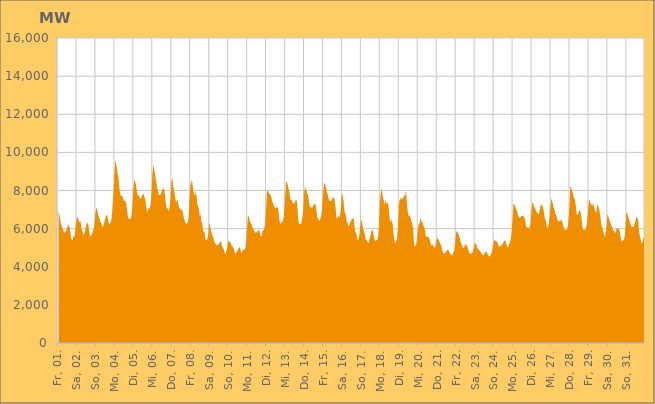
| Category | Series 0 |
|---|---|
|  Fr, 01.  | 6940.941 |
|  Fr, 01.  | 6739.258 |
|  Fr, 01.  | 6566.513 |
|  Fr, 01.  | 6304.722 |
|  Fr, 01.  | 6176.617 |
|  Fr, 01.  | 6011.631 |
|  Fr, 01.  | 5960.128 |
|  Fr, 01.  | 5780.79 |
|  Fr, 01.  | 5776.637 |
|  Fr, 01.  | 5831.027 |
|  Fr, 01.  | 5911.63 |
|  Fr, 01.  | 6049.373 |
|  Fr, 01.  | 6147.04 |
|  Fr, 01.  | 6184.899 |
|  Fr, 01.  | 6103.249 |
|  Fr, 01.  | 5828.684 |
|  Fr, 01.  | 5522.521 |
|  Sa, 02.  | 5409.463 |
|  Sa, 02.  | 5405.658 |
|  Sa, 02.  | 5591.512 |
|  Sa, 02.  | 5576.093 |
|  Sa, 02.  | 5728.649 |
|  Sa, 02.  | 6149.572 |
|  Sa, 02.  | 6496.762 |
|  Sa, 02.  | 6644.999 |
|  Sa, 02.  | 6506.655 |
|  Sa, 02.  | 6364.943 |
|  Sa, 02.  | 6335.772 |
|  Sa, 02.  | 6411.474 |
|  Sa, 02.  | 6051.06 |
|  Sa, 02.  | 5907.813 |
|  Sa, 02.  | 5770.088 |
|  Sa, 02.  | 5649.798 |
|  Sa, 02.  | 5758.059 |
|  Sa, 02.  | 5928.191 |
|  Sa, 02.  | 6102.328 |
|  Sa, 02.  | 6326.658 |
|  Sa, 02.  | 6273.171 |
|  Sa, 02.  | 6219.023 |
|  Sa, 02.  | 5820.166 |
|  Sa, 02.  | 5621.213 |
|  So, 03.  | 5581.824 |
|  So, 03.  | 5698.178 |
|  So, 03.  | 5755.172 |
|  So, 03.  | 5892.121 |
|  So, 03.  | 6033.169 |
|  So, 03.  | 6398.499 |
|  So, 03.  | 6897.129 |
|  So, 03.  | 7100.668 |
|  So, 03.  | 6984.817 |
|  So, 03.  | 6787.739 |
|  So, 03.  | 6628.526 |
|  So, 03.  | 6524.965 |
|  So, 03.  | 6350.751 |
|  So, 03.  | 6311.71 |
|  So, 03.  | 6190.914 |
|  So, 03.  | 6095.488 |
|  So, 03.  | 6129.065 |
|  So, 03.  | 6320.316 |
|  So, 03.  | 6461.078 |
|  So, 03.  | 6648.03 |
|  So, 03.  | 6714.557 |
|  So, 03.  | 6678.762 |
|  So, 03.  | 6441.161 |
|  So, 03.  | 6230.416 |
|  Mo, 04.  | 6219.88 |
|  Mo, 04.  | 6301.203 |
|  Mo, 04.  | 6453.599 |
|  Mo, 04.  | 6841.81 |
|  Mo, 04.  | 7497.036 |
|  Mo, 04.  | 8145.848 |
|  Mo, 04.  | 9015.004 |
|  Mo, 04.  | 9596.306 |
|  Mo, 04.  | 9405.317 |
|  Mo, 04.  | 9173.858 |
|  Mo, 04.  | 8860.302 |
|  Mo, 04.  | 8664.048 |
|  Mo, 04.  | 8208.187 |
|  Mo, 04.  | 7875.951 |
|  Mo, 04.  | 7732.502 |
|  Mo, 04.  | 7705.777 |
|  Mo, 04.  | 7732.987 |
|  Mo, 04.  | 7557.301 |
|  Mo, 04.  | 7435.131 |
|  Mo, 04.  | 7488.971 |
|  Mo, 04.  | 7441.708 |
|  Mo, 04.  | 7243.512 |
|  Mo, 04.  | 6962.741 |
|  Mo, 04.  | 6588.049 |
|  Di, 05.  | 6516.35 |
|  Di, 05.  | 6500.748 |
|  Di, 05.  | 6518.257 |
|  Di, 05.  | 6580.313 |
|  Di, 05.  | 6842.617 |
|  Di, 05.  | 7400.402 |
|  Di, 05.  | 8178.42 |
|  Di, 05.  | 8584.927 |
|  Di, 05.  | 8478.571 |
|  Di, 05.  | 8344.882 |
|  Di, 05.  | 8059.395 |
|  Di, 05.  | 7802.997 |
|  Di, 05.  | 7687.231 |
|  Di, 05.  | 7793.313 |
|  Di, 05.  | 7573.076 |
|  Di, 05.  | 7581.47 |
|  Di, 05.  | 7620.603 |
|  Di, 05.  | 7731.48 |
|  Di, 05.  | 7819.04 |
|  Di, 05.  | 7792.946 |
|  Di, 05.  | 7644.386 |
|  Di, 05.  | 7524.985 |
|  Di, 05.  | 7194.424 |
|  Di, 05.  | 6937.691 |
|  Mi, 06.  | 6901.247 |
|  Mi, 06.  | 7054.522 |
|  Mi, 06.  | 7062.578 |
|  Mi, 06.  | 7142.579 |
|  Mi, 06.  | 7385.198 |
|  Mi, 06.  | 8009.252 |
|  Mi, 06.  | 8886.016 |
|  Mi, 06.  | 9361.659 |
|  Mi, 06.  | 9191.132 |
|  Mi, 06.  | 8954.559 |
|  Mi, 06.  | 8681.927 |
|  Mi, 06.  | 8429.152 |
|  Mi, 06.  | 8149.973 |
|  Mi, 06.  | 7943.551 |
|  Mi, 06.  | 7775.279 |
|  Mi, 06.  | 7766.127 |
|  Mi, 06.  | 7766.795 |
|  Mi, 06.  | 7847.61 |
|  Mi, 06.  | 7992.179 |
|  Mi, 06.  | 8078.613 |
|  Mi, 06.  | 8131.767 |
|  Mi, 06.  | 8058.626 |
|  Mi, 06.  | 7659.033 |
|  Mi, 06.  | 7307.349 |
|  Do, 07.  | 7118.383 |
|  Do, 07.  | 7062.172 |
|  Do, 07.  | 6982.827 |
|  Do, 07.  | 6934.237 |
|  Do, 07.  | 7135.811 |
|  Do, 07.  | 7627.733 |
|  Do, 07.  | 8408.204 |
|  Do, 07.  | 8706.665 |
|  Do, 07.  | 8384.46 |
|  Do, 07.  | 8043.776 |
|  Do, 07.  | 7889.435 |
|  Do, 07.  | 7565.477 |
|  Do, 07.  | 7361.658 |
|  Do, 07.  | 7485.652 |
|  Do, 07.  | 7512.454 |
|  Do, 07.  | 7219.673 |
|  Do, 07.  | 7034.614 |
|  Do, 07.  | 7091.704 |
|  Do, 07.  | 6969.811 |
|  Do, 07.  | 7008.317 |
|  Do, 07.  | 6934.862 |
|  Do, 07.  | 6729.743 |
|  Do, 07.  | 6515.774 |
|  Do, 07.  | 6386.887 |
|  Fr, 08.  | 6299.63 |
|  Fr, 08.  | 6245.341 |
|  Fr, 08.  | 6286.407 |
|  Fr, 08.  | 6355.04 |
|  Fr, 08.  | 6658.022 |
|  Fr, 08.  | 7528.907 |
|  Fr, 08.  | 8250.186 |
|  Fr, 08.  | 8366.781 |
|  Fr, 08.  | 8564.421 |
|  Fr, 08.  | 8268.524 |
|  Fr, 08.  | 7974.971 |
|  Fr, 08.  | 7771.758 |
|  Fr, 08.  | 7752.536 |
|  Fr, 08.  | 7986.519 |
|  Fr, 08.  | 7638.517 |
|  Fr, 08.  | 7242.194 |
|  Fr, 08.  | 7181.447 |
|  Fr, 08.  | 6936.455 |
|  Fr, 08.  | 6651.68 |
|  Fr, 08.  | 6752.367 |
|  Fr, 08.  | 6356.49 |
|  Fr, 08.  | 6293.274 |
|  Fr, 08.  | 5955.833 |
|  Fr, 08.  | 5835.241 |
|  Sa, 09.  | 5844.34 |
|  Sa, 09.  | 5431.488 |
|  Sa, 09.  | 5407.277 |
|  Sa, 09.  | 5414.671 |
|  Sa, 09.  | 5508.668 |
|  Sa, 09.  | 5841.217 |
|  Sa, 09.  | 6315.136 |
|  Sa, 09.  | 6139.232 |
|  Sa, 09.  | 5931.343 |
|  Sa, 09.  | 5770.202 |
|  Sa, 09.  | 5645.962 |
|  Sa, 09.  | 5521.496 |
|  Sa, 09.  | 5338.773 |
|  Sa, 09.  | 5282.91 |
|  Sa, 09.  | 5176.031 |
|  Sa, 09.  | 5116.956 |
|  Sa, 09.  | 5170.961 |
|  Sa, 09.  | 5144.261 |
|  Sa, 09.  | 5169.052 |
|  Sa, 09.  | 5285.176 |
|  Sa, 09.  | 5295.284 |
|  Sa, 09.  | 5318.763 |
|  Sa, 09.  | 5142.766 |
|  Sa, 09.  | 4984.332 |
|  So, 10.  | 4947.268 |
|  So, 10.  | 4809.949 |
|  So, 10.  | 4657.779 |
|  So, 10.  | 4750.905 |
|  So, 10.  | 4888.639 |
|  So, 10.  | 5074.729 |
|  So, 10.  | 5310.93 |
|  So, 10.  | 5350.461 |
|  So, 10.  | 5298.902 |
|  So, 10.  | 5227.756 |
|  So, 10.  | 5142.026 |
|  So, 10.  | 5091.097 |
|  So, 10.  | 5021.757 |
|  So, 10.  | 4949.633 |
|  So, 10.  | 4767.51 |
|  So, 10.  | 4671.282 |
|  So, 10.  | 4720.537 |
|  So, 10.  | 4798.763 |
|  So, 10.  | 4877.039 |
|  So, 10.  | 4981.945 |
|  So, 10.  | 5013.374 |
|  So, 10.  | 5018.523 |
|  So, 10.  | 4784.32 |
|  So, 10.  | 4698.295 |
|  Mo, 11.  | 4872.63 |
|  Mo, 11.  | 4913.115 |
|  Mo, 11.  | 4875.96 |
|  Mo, 11.  | 4907.183 |
|  Mo, 11.  | 5058.537 |
|  Mo, 11.  | 5512.991 |
|  Mo, 11.  | 6140.837 |
|  Mo, 11.  | 6720.662 |
|  Mo, 11.  | 6625.872 |
|  Mo, 11.  | 6438.764 |
|  Mo, 11.  | 6286.551 |
|  Mo, 11.  | 6304.206 |
|  Mo, 11.  | 6148.903 |
|  Mo, 11.  | 6035.615 |
|  Mo, 11.  | 5964.99 |
|  Mo, 11.  | 5870.878 |
|  Mo, 11.  | 5797.363 |
|  Mo, 11.  | 5789.082 |
|  Mo, 11.  | 5869.312 |
|  Mo, 11.  | 5756.9 |
|  Mo, 11.  | 5914.239 |
|  Mo, 11.  | 5979.977 |
|  Mo, 11.  | 5790.845 |
|  Mo, 11.  | 5613.295 |
|  Di, 12.  | 5590.568 |
|  Di, 12.  | 5793.735 |
|  Di, 12.  | 5962.776 |
|  Di, 12.  | 5882.813 |
|  Di, 12.  | 6107.506 |
|  Di, 12.  | 6428.469 |
|  Di, 12.  | 7082.548 |
|  Di, 12.  | 7955.311 |
|  Di, 12.  | 8036.85 |
|  Di, 12.  | 7901.588 |
|  Di, 12.  | 7828.11 |
|  Di, 12.  | 7787.923 |
|  Di, 12.  | 7715.321 |
|  Di, 12.  | 7564.619 |
|  Di, 12.  | 7367.352 |
|  Di, 12.  | 7293.897 |
|  Di, 12.  | 7201.136 |
|  Di, 12.  | 7074.018 |
|  Di, 12.  | 7083.794 |
|  Di, 12.  | 7124.641 |
|  Di, 12.  | 7117.595 |
|  Di, 12.  | 7074.525 |
|  Di, 12.  | 6725.93 |
|  Di, 12.  | 6367.575 |
|  Mi, 13.  | 6253.256 |
|  Mi, 13.  | 6313.547 |
|  Mi, 13.  | 6347.619 |
|  Mi, 13.  | 6385.207 |
|  Mi, 13.  | 6559.589 |
|  Mi, 13.  | 6955.706 |
|  Mi, 13.  | 7693.446 |
|  Mi, 13.  | 8375.839 |
|  Mi, 13.  | 8493.11 |
|  Mi, 13.  | 8347.929 |
|  Mi, 13.  | 8170.31 |
|  Mi, 13.  | 7957.844 |
|  Mi, 13.  | 7737.442 |
|  Mi, 13.  | 7482.862 |
|  Mi, 13.  | 7525.191 |
|  Mi, 13.  | 7428.151 |
|  Mi, 13.  | 7323.42 |
|  Mi, 13.  | 7315.59 |
|  Mi, 13.  | 7348.202 |
|  Mi, 13.  | 7483.458 |
|  Mi, 13.  | 7499.139 |
|  Mi, 13.  | 7428.787 |
|  Mi, 13.  | 6776.912 |
|  Mi, 13.  | 6355.77 |
|  Do, 14.  | 6241.039 |
|  Do, 14.  | 6232.647 |
|  Do, 14.  | 6229.824 |
|  Do, 14.  | 6382.673 |
|  Do, 14.  | 6598.99 |
|  Do, 14.  | 7048.792 |
|  Do, 14.  | 7803.635 |
|  Do, 14.  | 8238.75 |
|  Do, 14.  | 8054.808 |
|  Do, 14.  | 7997.929 |
|  Do, 14.  | 7862.467 |
|  Do, 14.  | 7721.193 |
|  Do, 14.  | 7500.142 |
|  Do, 14.  | 7191.403 |
|  Do, 14.  | 7120.131 |
|  Do, 14.  | 7143.967 |
|  Do, 14.  | 7023.727 |
|  Do, 14.  | 7168.092 |
|  Do, 14.  | 7224.247 |
|  Do, 14.  | 7289.154 |
|  Do, 14.  | 7308.468 |
|  Do, 14.  | 7157.33 |
|  Do, 14.  | 6801.337 |
|  Do, 14.  | 6549.014 |
|  Fr, 15.  | 6467.612 |
|  Fr, 15.  | 6450.168 |
|  Fr, 15.  | 6429.603 |
|  Fr, 15.  | 6590.064 |
|  Fr, 15.  | 6737.266 |
|  Fr, 15.  | 7164.789 |
|  Fr, 15.  | 7774.759 |
|  Fr, 15.  | 8313.161 |
|  Fr, 15.  | 8404.439 |
|  Fr, 15.  | 8277.145 |
|  Fr, 15.  | 8123.878 |
|  Fr, 15.  | 7892.338 |
|  Fr, 15.  | 7766.099 |
|  Fr, 15.  | 7570.181 |
|  Fr, 15.  | 7463.245 |
|  Fr, 15.  | 7432.112 |
|  Fr, 15.  | 7460.054 |
|  Fr, 15.  | 7480.432 |
|  Fr, 15.  | 7651.747 |
|  Fr, 15.  | 7620.449 |
|  Fr, 15.  | 7615.155 |
|  Fr, 15.  | 7452.642 |
|  Fr, 15.  | 7000.116 |
|  Fr, 15.  | 6587.854 |
|  Sa, 16.  | 6518.375 |
|  Sa, 16.  | 6617.061 |
|  Sa, 16.  | 6673.63 |
|  Sa, 16.  | 6564.798 |
|  Sa, 16.  | 6813.724 |
|  Sa, 16.  | 7311.014 |
|  Sa, 16.  | 7855.725 |
|  Sa, 16.  | 7711.247 |
|  Sa, 16.  | 7421.939 |
|  Sa, 16.  | 6960.778 |
|  Sa, 16.  | 6783.763 |
|  Sa, 16.  | 6673.933 |
|  Sa, 16.  | 6375.329 |
|  Sa, 16.  | 6283.528 |
|  Sa, 16.  | 6132.714 |
|  Sa, 16.  | 6140.849 |
|  Sa, 16.  | 6302.634 |
|  Sa, 16.  | 6369.684 |
|  Sa, 16.  | 6482.692 |
|  Sa, 16.  | 6542.46 |
|  Sa, 16.  | 6524.826 |
|  Sa, 16.  | 6454.729 |
|  Sa, 16.  | 6056.191 |
|  Sa, 16.  | 5829.791 |
|  So, 17.  | 5765.609 |
|  So, 17.  | 5523.428 |
|  So, 17.  | 5401.811 |
|  So, 17.  | 5448.04 |
|  So, 17.  | 5687.386 |
|  So, 17.  | 6085.963 |
|  So, 17.  | 6516.833 |
|  So, 17.  | 6333.672 |
|  So, 17.  | 6171.106 |
|  So, 17.  | 5942.322 |
|  So, 17.  | 5826.132 |
|  So, 17.  | 5672.835 |
|  So, 17.  | 5434.964 |
|  So, 17.  | 5402.992 |
|  So, 17.  | 5326.135 |
|  So, 17.  | 5225.341 |
|  So, 17.  | 5276.278 |
|  So, 17.  | 5482.074 |
|  So, 17.  | 5634.32 |
|  So, 17.  | 5845.64 |
|  So, 17.  | 5915.769 |
|  So, 17.  | 5928.856 |
|  So, 17.  | 5645.638 |
|  So, 17.  | 5471.489 |
|  Mo, 18.  | 5388.233 |
|  Mo, 18.  | 5349.83 |
|  Mo, 18.  | 5417.257 |
|  Mo, 18.  | 5432.458 |
|  Mo, 18.  | 5614.432 |
|  Mo, 18.  | 6370.615 |
|  Mo, 18.  | 7383.598 |
|  Mo, 18.  | 7873.872 |
|  Mo, 18.  | 8101.908 |
|  Mo, 18.  | 7847.805 |
|  Mo, 18.  | 7591.516 |
|  Mo, 18.  | 7449.332 |
|  Mo, 18.  | 7226.747 |
|  Mo, 18.  | 7493.631 |
|  Mo, 18.  | 7352.321 |
|  Mo, 18.  | 7275.685 |
|  Mo, 18.  | 7408.105 |
|  Mo, 18.  | 7095.693 |
|  Mo, 18.  | 6580.459 |
|  Mo, 18.  | 6362.076 |
|  Mo, 18.  | 6364.488 |
|  Mo, 18.  | 6490.26 |
|  Mo, 18.  | 6253.468 |
|  Mo, 18.  | 5801.814 |
|  Di, 19.  | 5500.135 |
|  Di, 19.  | 5210.391 |
|  Di, 19.  | 5291.055 |
|  Di, 19.  | 5369.21 |
|  Di, 19.  | 5579.766 |
|  Di, 19.  | 6232.171 |
|  Di, 19.  | 7218.992 |
|  Di, 19.  | 7522.47 |
|  Di, 19.  | 7561.012 |
|  Di, 19.  | 7644.927 |
|  Di, 19.  | 7470.838 |
|  Di, 19.  | 7689.736 |
|  Di, 19.  | 7610.502 |
|  Di, 19.  | 7783.359 |
|  Di, 19.  | 7708.839 |
|  Di, 19.  | 8042.584 |
|  Di, 19.  | 7371.188 |
|  Di, 19.  | 6965.758 |
|  Di, 19.  | 6644.872 |
|  Di, 19.  | 6725.097 |
|  Di, 19.  | 6648.919 |
|  Di, 19.  | 6525.687 |
|  Di, 19.  | 6359.439 |
|  Di, 19.  | 6217.795 |
|  Mi, 20.  | 5992.014 |
|  Mi, 20.  | 5344.977 |
|  Mi, 20.  | 5044.105 |
|  Mi, 20.  | 5098.006 |
|  Mi, 20.  | 5184.452 |
|  Mi, 20.  | 5459.634 |
|  Mi, 20.  | 5913.645 |
|  Mi, 20.  | 6262.357 |
|  Mi, 20.  | 6214.271 |
|  Mi, 20.  | 6557.803 |
|  Mi, 20.  | 6482.433 |
|  Mi, 20.  | 6327.669 |
|  Mi, 20.  | 6329.755 |
|  Mi, 20.  | 6178.632 |
|  Mi, 20.  | 6031.205 |
|  Mi, 20.  | 5940.093 |
|  Mi, 20.  | 5620.781 |
|  Mi, 20.  | 5554.018 |
|  Mi, 20.  | 5582.766 |
|  Mi, 20.  | 5546.22 |
|  Mi, 20.  | 5532.386 |
|  Mi, 20.  | 5434.841 |
|  Mi, 20.  | 5251.835 |
|  Mi, 20.  | 5093.857 |
|  Do, 21.  | 5167.147 |
|  Do, 21.  | 5145.073 |
|  Do, 21.  | 5049.425 |
|  Do, 21.  | 4997.143 |
|  Do, 21.  | 5031.824 |
|  Do, 21.  | 5207.492 |
|  Do, 21.  | 5488.804 |
|  Do, 21.  | 5538.299 |
|  Do, 21.  | 5412.507 |
|  Do, 21.  | 5358.937 |
|  Do, 21.  | 5216.507 |
|  Do, 21.  | 5172.609 |
|  Do, 21.  | 5049.897 |
|  Do, 21.  | 4860.251 |
|  Do, 21.  | 4738.531 |
|  Do, 21.  | 4672.697 |
|  Do, 21.  | 4704.215 |
|  Do, 21.  | 4775.351 |
|  Do, 21.  | 4785.068 |
|  Do, 21.  | 4889.667 |
|  Do, 21.  | 4867.253 |
|  Do, 21.  | 4882.579 |
|  Do, 21.  | 4743.272 |
|  Do, 21.  | 4687.548 |
|  Fr, 22.  | 4647.886 |
|  Fr, 22.  | 4577.594 |
|  Fr, 22.  | 4634.035 |
|  Fr, 22.  | 4745.398 |
|  Fr, 22.  | 4875.796 |
|  Fr, 22.  | 5189.132 |
|  Fr, 22.  | 5717.822 |
|  Fr, 22.  | 5882.445 |
|  Fr, 22.  | 5816.819 |
|  Fr, 22.  | 5763.556 |
|  Fr, 22.  | 5645.766 |
|  Fr, 22.  | 5521.78 |
|  Fr, 22.  | 5303.123 |
|  Fr, 22.  | 5195.489 |
|  Fr, 22.  | 5107.83 |
|  Fr, 22.  | 4983.468 |
|  Fr, 22.  | 4992.506 |
|  Fr, 22.  | 5055.264 |
|  Fr, 22.  | 5186.865 |
|  Fr, 22.  | 5171.338 |
|  Fr, 22.  | 5100.808 |
|  Fr, 22.  | 5040.7 |
|  Fr, 22.  | 4859.987 |
|  Fr, 22.  | 4731.231 |
|  Sa, 23.  | 4671.86 |
|  Sa, 23.  | 4699.291 |
|  Sa, 23.  | 4694.222 |
|  Sa, 23.  | 4732.757 |
|  Sa, 23.  | 4859.673 |
|  Sa, 23.  | 5007.118 |
|  Sa, 23.  | 5267.103 |
|  Sa, 23.  | 5212.24 |
|  Sa, 23.  | 5160.725 |
|  Sa, 23.  | 5001.54 |
|  Sa, 23.  | 4928.195 |
|  Sa, 23.  | 4916.723 |
|  Sa, 23.  | 4855.429 |
|  Sa, 23.  | 4808.141 |
|  Sa, 23.  | 4718.724 |
|  Sa, 23.  | 4690.213 |
|  Sa, 23.  | 4612.695 |
|  Sa, 23.  | 4603.457 |
|  Sa, 23.  | 4676 |
|  Sa, 23.  | 4744.642 |
|  Sa, 23.  | 4796.622 |
|  Sa, 23.  | 4781.514 |
|  Sa, 23.  | 4675.12 |
|  Sa, 23.  | 4598.67 |
|  So, 24.  | 4579.139 |
|  So, 24.  | 4517.883 |
|  So, 24.  | 4591.152 |
|  So, 24.  | 4709.302 |
|  So, 24.  | 4820.554 |
|  So, 24.  | 5080.151 |
|  So, 24.  | 5338.149 |
|  So, 24.  | 5428.188 |
|  So, 24.  | 5344.376 |
|  So, 24.  | 5345.231 |
|  So, 24.  | 5315.827 |
|  So, 24.  | 5255.275 |
|  So, 24.  | 5101.915 |
|  So, 24.  | 5038.648 |
|  So, 24.  | 5063.278 |
|  So, 24.  | 5125.75 |
|  So, 24.  | 5096.456 |
|  So, 24.  | 5190.17 |
|  So, 24.  | 5267.227 |
|  So, 24.  | 5338.752 |
|  So, 24.  | 5389.822 |
|  So, 24.  | 5340.195 |
|  So, 24.  | 5189.029 |
|  So, 24.  | 5079.821 |
|  Mo, 25.  | 4981.508 |
|  Mo, 25.  | 5144.986 |
|  Mo, 25.  | 5247.661 |
|  Mo, 25.  | 5338.759 |
|  Mo, 25.  | 5549.78 |
|  Mo, 25.  | 5966.723 |
|  Mo, 25.  | 6626.963 |
|  Mo, 25.  | 7300.725 |
|  Mo, 25.  | 7252.806 |
|  Mo, 25.  | 7212.673 |
|  Mo, 25.  | 7042.837 |
|  Mo, 25.  | 6968.608 |
|  Mo, 25.  | 6849.149 |
|  Mo, 25.  | 6693.662 |
|  Mo, 25.  | 6571.926 |
|  Mo, 25.  | 6573.024 |
|  Mo, 25.  | 6579.077 |
|  Mo, 25.  | 6673.86 |
|  Mo, 25.  | 6666.11 |
|  Mo, 25.  | 6675.077 |
|  Mo, 25.  | 6624.19 |
|  Mo, 25.  | 6573.864 |
|  Mo, 25.  | 6398.548 |
|  Mo, 25.  | 6133.208 |
|  Di, 26.  | 6043.913 |
|  Di, 26.  | 6066.667 |
|  Di, 26.  | 6006.577 |
|  Di, 26.  | 6016.423 |
|  Di, 26.  | 6133.777 |
|  Di, 26.  | 6471.344 |
|  Di, 26.  | 7051.208 |
|  Di, 26.  | 7401.677 |
|  Di, 26.  | 7305.303 |
|  Di, 26.  | 7153.183 |
|  Di, 26.  | 7104.331 |
|  Di, 26.  | 6980.909 |
|  Di, 26.  | 6873.351 |
|  Di, 26.  | 6804.857 |
|  Di, 26.  | 6832.97 |
|  Di, 26.  | 6695.587 |
|  Di, 26.  | 6922.522 |
|  Di, 26.  | 7181.763 |
|  Di, 26.  | 7269.213 |
|  Di, 26.  | 7225.871 |
|  Di, 26.  | 7140.284 |
|  Di, 26.  | 7016.676 |
|  Di, 26.  | 6712.753 |
|  Di, 26.  | 6482.37 |
|  Mi, 27.  | 6412.524 |
|  Mi, 27.  | 6160.097 |
|  Mi, 27.  | 5998.367 |
|  Mi, 27.  | 6097.677 |
|  Mi, 27.  | 6340.118 |
|  Mi, 27.  | 6736.485 |
|  Mi, 27.  | 7283.973 |
|  Mi, 27.  | 7576.654 |
|  Mi, 27.  | 7449.196 |
|  Mi, 27.  | 7251.655 |
|  Mi, 27.  | 7100.345 |
|  Mi, 27.  | 6998.998 |
|  Mi, 27.  | 6763.578 |
|  Mi, 27.  | 6696.876 |
|  Mi, 27.  | 6579.873 |
|  Mi, 27.  | 6398.999 |
|  Mi, 27.  | 6397.793 |
|  Mi, 27.  | 6398.156 |
|  Mi, 27.  | 6410.882 |
|  Mi, 27.  | 6436.501 |
|  Mi, 27.  | 6461.546 |
|  Mi, 27.  | 6320.784 |
|  Mi, 27.  | 6140.039 |
|  Mi, 27.  | 6001.279 |
|  Do, 28.  | 5924.023 |
|  Do, 28.  | 5940.968 |
|  Do, 28.  | 5927.111 |
|  Do, 28.  | 5984.467 |
|  Do, 28.  | 6180.361 |
|  Do, 28.  | 6551.5 |
|  Do, 28.  | 7259.199 |
|  Do, 28.  | 8229.267 |
|  Do, 28.  | 8137.66 |
|  Do, 28.  | 7993.571 |
|  Do, 28.  | 7886.863 |
|  Do, 28.  | 7717.516 |
|  Do, 28.  | 7593.113 |
|  Do, 28.  | 7496.336 |
|  Do, 28.  | 7125.438 |
|  Do, 28.  | 6744.457 |
|  Do, 28.  | 6733.236 |
|  Do, 28.  | 6778.783 |
|  Do, 28.  | 6941.338 |
|  Do, 28.  | 6967.223 |
|  Do, 28.  | 6879.135 |
|  Do, 28.  | 6591.124 |
|  Do, 28.  | 6176.458 |
|  Do, 28.  | 5984.318 |
|  Fr, 29.  | 5931.791 |
|  Fr, 29.  | 5958.681 |
|  Fr, 29.  | 5942.597 |
|  Fr, 29.  | 6072.482 |
|  Fr, 29.  | 6270.512 |
|  Fr, 29.  | 6703.34 |
|  Fr, 29.  | 7272.379 |
|  Fr, 29.  | 7558.449 |
|  Fr, 29.  | 7411.812 |
|  Fr, 29.  | 7287.64 |
|  Fr, 29.  | 7236.578 |
|  Fr, 29.  | 7204.636 |
|  Fr, 29.  | 7346.504 |
|  Fr, 29.  | 7119.751 |
|  Fr, 29.  | 6973.437 |
|  Fr, 29.  | 6863.694 |
|  Fr, 29.  | 6851.772 |
|  Fr, 29.  | 7167.666 |
|  Fr, 29.  | 7281.885 |
|  Fr, 29.  | 7111.113 |
|  Fr, 29.  | 6895.237 |
|  Fr, 29.  | 6654.443 |
|  Fr, 29.  | 6288.127 |
|  Fr, 29.  | 6071.162 |
|  Sa, 30.  | 5999.805 |
|  Sa, 30.  | 5803.058 |
|  Sa, 30.  | 5590.954 |
|  Sa, 30.  | 5629.66 |
|  Sa, 30.  | 5868.867 |
|  Sa, 30.  | 6251.978 |
|  Sa, 30.  | 6740.434 |
|  Sa, 30.  | 6714.924 |
|  Sa, 30.  | 6479.058 |
|  Sa, 30.  | 6390.677 |
|  Sa, 30.  | 6259.949 |
|  Sa, 30.  | 6148.558 |
|  Sa, 30.  | 6098.099 |
|  Sa, 30.  | 5933.994 |
|  Sa, 30.  | 5884.752 |
|  Sa, 30.  | 5783.571 |
|  Sa, 30.  | 5796.283 |
|  Sa, 30.  | 5928.303 |
|  Sa, 30.  | 6027.941 |
|  Sa, 30.  | 5952.35 |
|  Sa, 30.  | 6011.613 |
|  Sa, 30.  | 5978.708 |
|  Sa, 30.  | 5715.17 |
|  Sa, 30.  | 5475.984 |
|  So, 31.  | 5298.652 |
|  So, 31.  | 5394.278 |
|  So, 31.  | 5350.309 |
|  So, 31.  | 5441.504 |
|  So, 31.  | 5684.122 |
|  So, 31.  | 6172.982 |
|  So, 31.  | 6774.686 |
|  So, 31.  | 6905.427 |
|  So, 31.  | 6653.581 |
|  So, 31.  | 6495.567 |
|  So, 31.  | 6426.154 |
|  So, 31.  | 6257.86 |
|  So, 31.  | 6141.941 |
|  So, 31.  | 6085.251 |
|  So, 31.  | 6099.587 |
|  So, 31.  | 6092.28 |
|  So, 31.  | 6176.158 |
|  So, 31.  | 6380.916 |
|  So, 31.  | 6507.388 |
|  So, 31.  | 6619.374 |
|  So, 31.  | 6552.564 |
|  So, 31.  | 6364.52 |
|  So, 31.  | 5848.638 |
|  So, 31.  | 5598.58 |
|  Mo, 01.  | 5459.43 |
|  Mo, 01.  | 5251.802 |
|  Mo, 01.  | 5241.066 |
|  Mo, 01.  | 5363.791 |
|  Mo, 01.  | 5543.811 |
|  Mo, 01.  | 5926.071 |